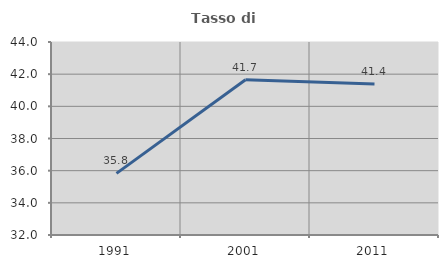
| Category | Tasso di occupazione   |
|---|---|
| 1991.0 | 35.83 |
| 2001.0 | 41.651 |
| 2011.0 | 41.382 |